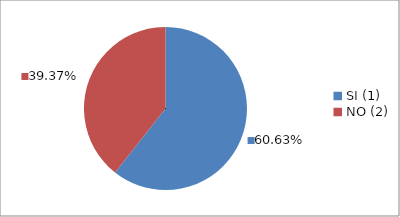
| Category | Series 0 |
|---|---|
| SI (1) | 0.606 |
| NO (2) | 0.394 |